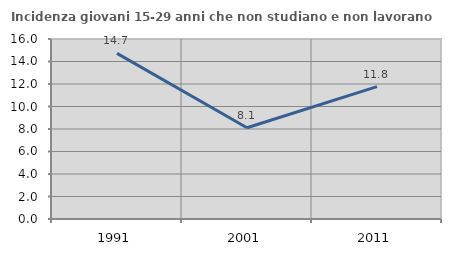
| Category | Incidenza giovani 15-29 anni che non studiano e non lavorano  |
|---|---|
| 1991.0 | 14.726 |
| 2001.0 | 8.108 |
| 2011.0 | 11.765 |